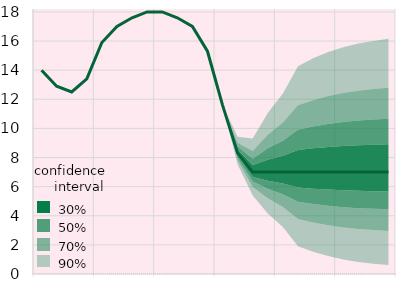
| Category | Series 8 | Series 11 |
|---|---|---|
|  | 14 |  |
|  | 12.9 |  |
|  | 12.5 |  |
| IV.17 | 13.4 |  |
|  | 15.9 |  |
|  | 17 |  |
|  | 17.6 |  |
| IV.18 | 18 |  |
|  | 18 |  |
|  | 17.6 |  |
|  | 17 |  |
| IV.19 | 15.3 |  |
|  | 11.6 |  |
|  | 8.3 |  |
|  | 7 |  |
| IV.20 | 7 |  |
|  | 7 |  |
|  | 7 |  |
|  | 7 |  |
| IV.21 | 7 |  |
|  | 7 |  |
|  | 7 |  |
|  | 7 |  |
| IV.22 | 7 |  |